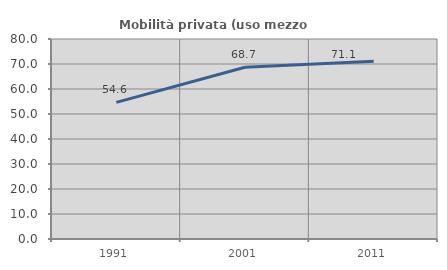
| Category | Mobilità privata (uso mezzo privato) |
|---|---|
| 1991.0 | 54.633 |
| 2001.0 | 68.697 |
| 2011.0 | 71.08 |